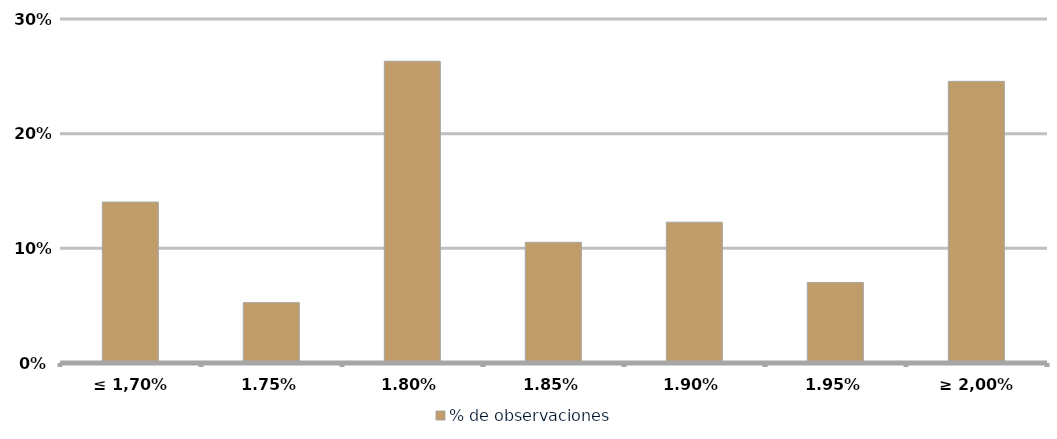
| Category | % de observaciones  |
|---|---|
| ≤ 1,70% | 0.14 |
| 1,75% | 0.053 |
| 1,80% | 0.263 |
| 1,85% | 0.105 |
| 1,90% | 0.123 |
| 1,95% | 0.07 |
| ≥ 2,00% | 0.246 |